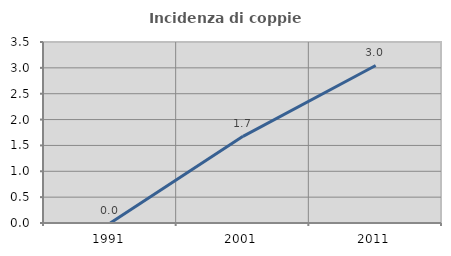
| Category | Incidenza di coppie miste |
|---|---|
| 1991.0 | 0 |
| 2001.0 | 1.676 |
| 2011.0 | 3.046 |